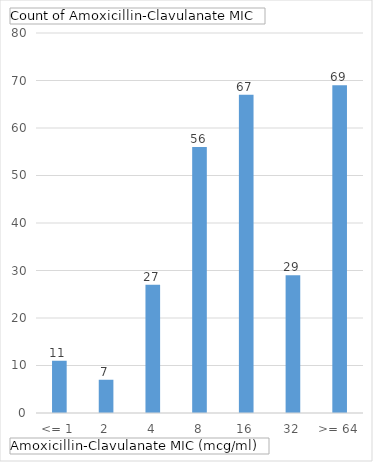
| Category | Total |
|---|---|
| <= 1 | 11 |
| 2 | 7 |
| 4 | 27 |
| 8 | 56 |
| 16 | 67 |
| 32 | 29 |
| >= 64 | 69 |